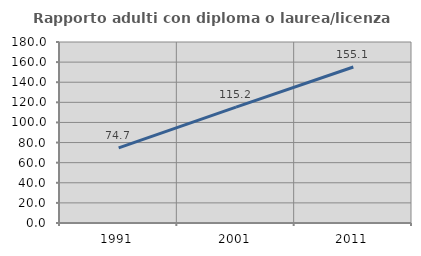
| Category | Rapporto adulti con diploma o laurea/licenza media  |
|---|---|
| 1991.0 | 74.737 |
| 2001.0 | 115.2 |
| 2011.0 | 155.096 |